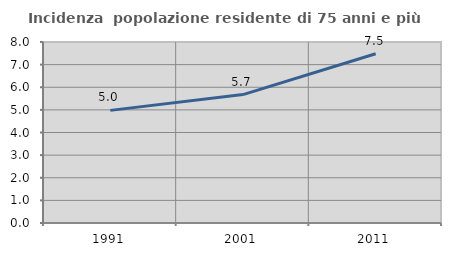
| Category | Incidenza  popolazione residente di 75 anni e più |
|---|---|
| 1991.0 | 4.978 |
| 2001.0 | 5.676 |
| 2011.0 | 7.481 |